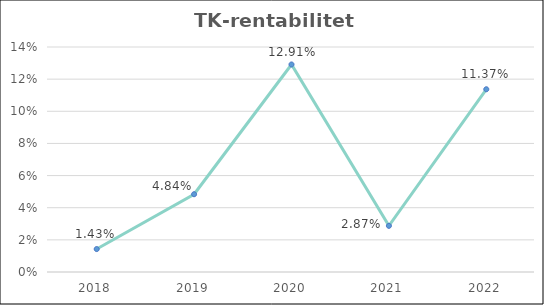
| Category | TK-rentabilitet |
|---|---|
| 2018 | 0.014 |
| 2019 | 0.048 |
| 2020 | 0.129 |
| 2021 | 0.029 |
| 2022 | 0.114 |